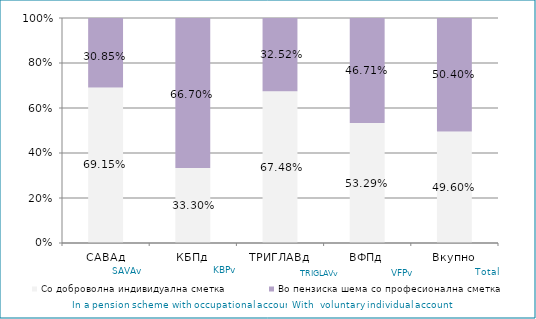
| Category | Со доброволна индивидуална сметка  | Во пензиска шема со професионална сметка |
|---|---|---|
| САВАд | 0.691 | 0.309 |
| КБПд | 0.333 | 0.667 |
| ТРИГЛАВд | 0.675 | 0.325 |
| ВФПд | 0.533 | 0.467 |
| Вкупно | 0.496 | 0.504 |